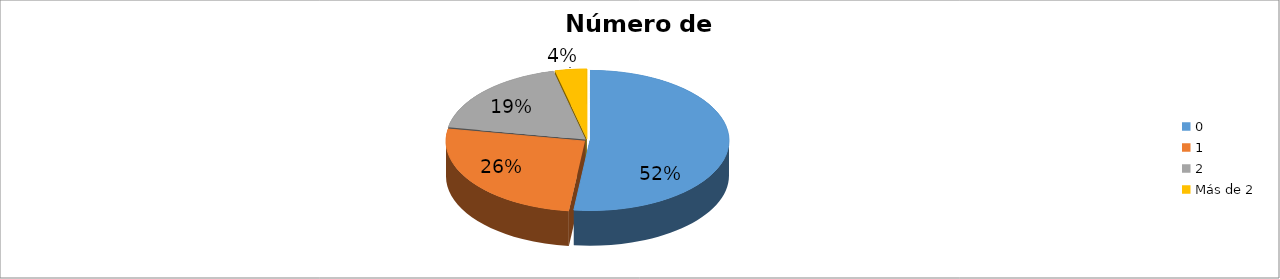
| Category | Series 0 |
|---|---|
| 0 | 0.519 |
| 1 | 0.259 |
| 2 | 0.185 |
| Más de 2 | 0.037 |